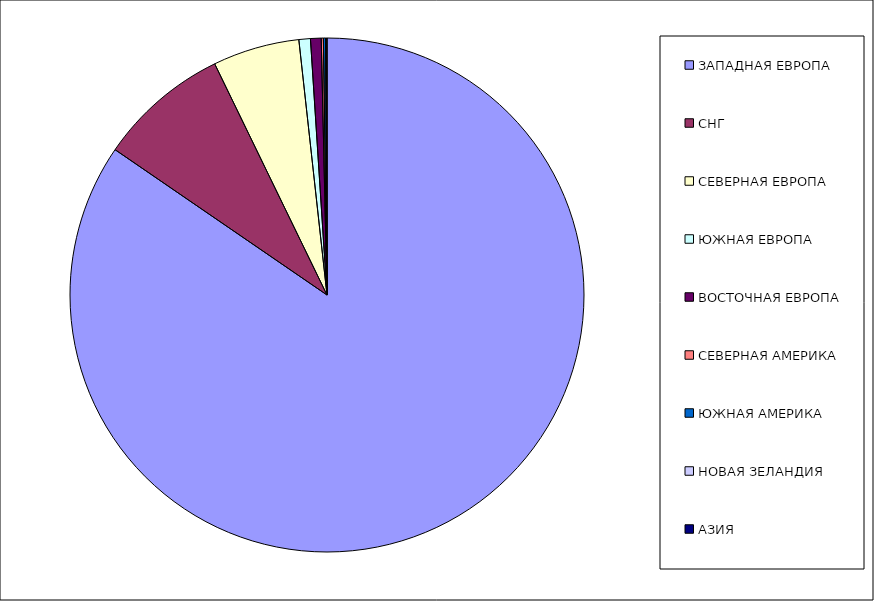
| Category | Оборот |
|---|---|
| ЗАПАДНАЯ ЕВРОПА | 0.846 |
| СНГ | 0.082 |
| СЕВЕРНАЯ ЕВРОПА | 0.054 |
| ЮЖНАЯ ЕВРОПА | 0.007 |
| ВОСТОЧНАЯ ЕВРОПА | 0.007 |
| СЕВЕРНАЯ АМЕРИКА | 0.001 |
| ЮЖНАЯ АМЕРИКА | 0.001 |
| НОВАЯ ЗЕЛАНДИЯ | 0.001 |
| АЗИЯ | 0 |